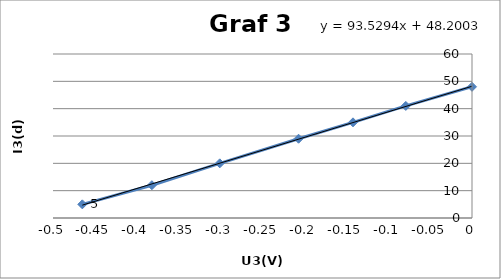
| Category | Series 0 |
|---|---|
| 0.0 | 48 |
| -0.079 | 41 |
| -0.142 | 35 |
| -0.207 | 29 |
| -0.301 | 20 |
| -0.382 | 12 |
| -0.465 | 5 |